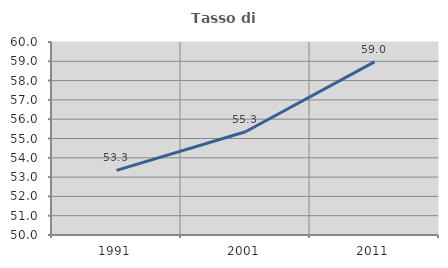
| Category | Tasso di occupazione   |
|---|---|
| 1991.0 | 53.348 |
| 2001.0 | 55.348 |
| 2011.0 | 58.969 |